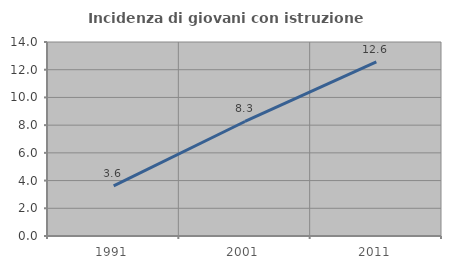
| Category | Incidenza di giovani con istruzione universitaria |
|---|---|
| 1991.0 | 3.623 |
| 2001.0 | 8.264 |
| 2011.0 | 12.563 |